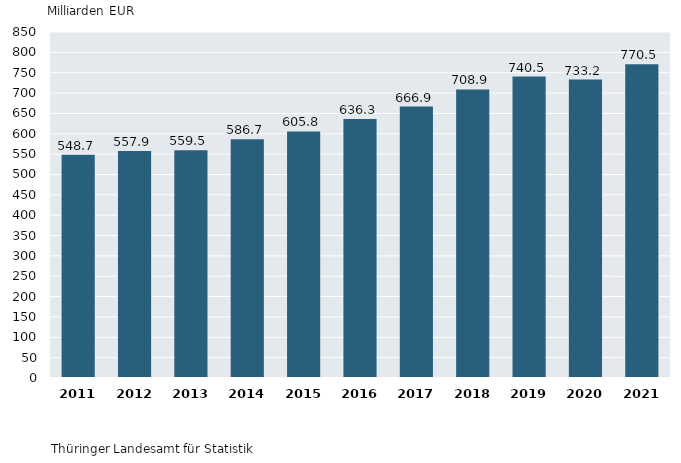
| Category | 2. Bruttoanlageinvestitionen in jeweiligen Preisen in Deutschland 2011 bis 2021 |
|---|---|
| 2011.0 | 548.7 |
| 2012.0 | 557.9 |
| 2013.0 | 559.5 |
| 2014.0 | 586.7 |
| 2015.0 | 605.8 |
| 2016.0 | 636.3 |
| 2017.0 | 666.9 |
| 2018.0 | 708.9 |
| 2019.0 | 740.5 |
| 2020.0 | 733.2 |
| 2021.0 | 770.5 |